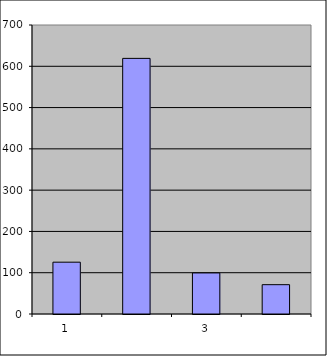
| Category | Series 0 |
|---|---|
| 0 | 125.5 |
| 1 | 619.156 |
| 2 | 99.442 |
| 3 | 71.009 |